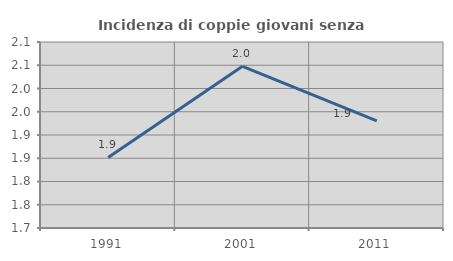
| Category | Incidenza di coppie giovani senza figli |
|---|---|
| 1991.0 | 1.852 |
| 2001.0 | 2.048 |
| 2011.0 | 1.931 |